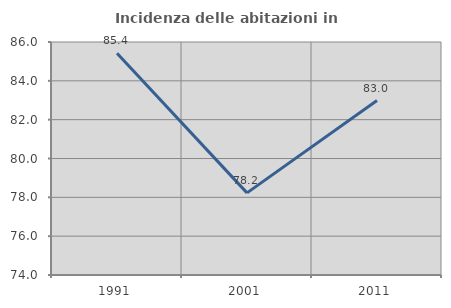
| Category | Incidenza delle abitazioni in proprietà  |
|---|---|
| 1991.0 | 85.425 |
| 2001.0 | 78.229 |
| 2011.0 | 82.987 |